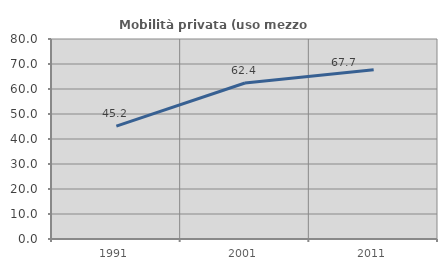
| Category | Mobilità privata (uso mezzo privato) |
|---|---|
| 1991.0 | 45.152 |
| 2001.0 | 62.408 |
| 2011.0 | 67.66 |